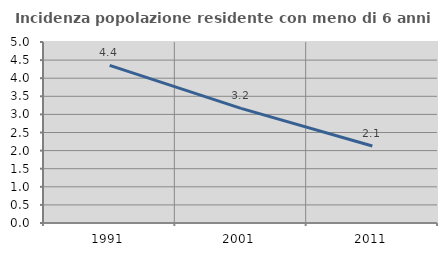
| Category | Incidenza popolazione residente con meno di 6 anni |
|---|---|
| 1991.0 | 4.355 |
| 2001.0 | 3.165 |
| 2011.0 | 2.128 |